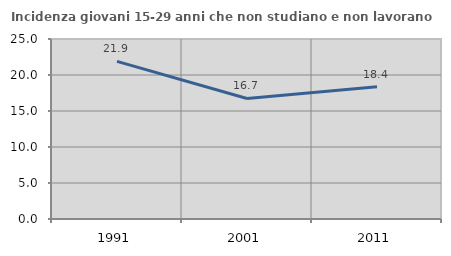
| Category | Incidenza giovani 15-29 anni che non studiano e non lavorano  |
|---|---|
| 1991.0 | 21.886 |
| 2001.0 | 16.74 |
| 2011.0 | 18.384 |